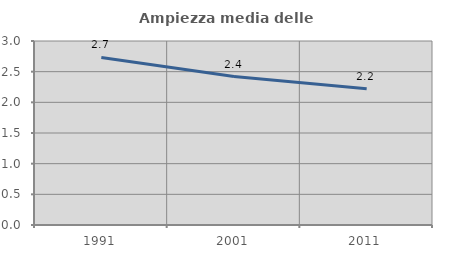
| Category | Ampiezza media delle famiglie |
|---|---|
| 1991.0 | 2.732 |
| 2001.0 | 2.421 |
| 2011.0 | 2.221 |